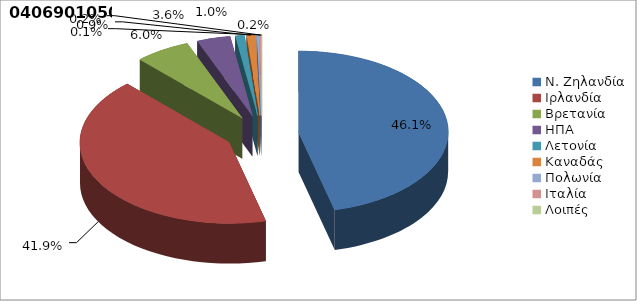
| Category | Series 0 |
|---|---|
| Ν. Ζηλανδία | 0.461 |
| Ιρλανδία | 0.419 |
| Βρετανία | 0.06 |
| ΗΠΑ | 0.036 |
| Λετονία | 0.01 |
| Καναδάς | 0.009 |
| Πολωνία | 0.002 |
| Ιταλία | 0.002 |
| Λοιπές | 0.001 |